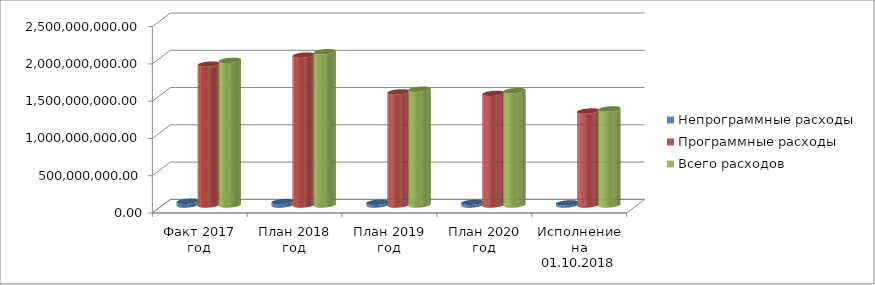
| Category | Непрограммные расходы | Программные расходы | Всего расходов |
|---|---|---|---|
| Факт 2017 год | 50335615.32 | 1889977262.2 | 1940312877.52 |
| План 2018 год | 45940092.84 | 2010068935.41 | 2056009028.25 |
| План 2019 год | 36494820 | 1516958290 | 1553453110 |
| План 2020 год | 36515620 | 1497605080 | 1534120700 |
| Исполнение на 01.10.2018 года | 28190886.37 | 1260785995.24 | 1288976881.61 |